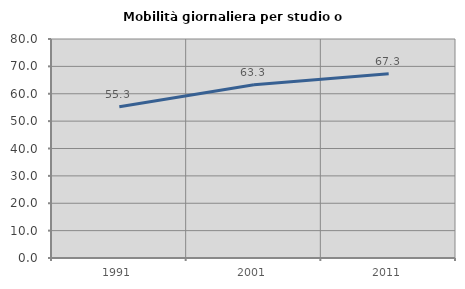
| Category | Mobilità giornaliera per studio o lavoro |
|---|---|
| 1991.0 | 55.269 |
| 2001.0 | 63.259 |
| 2011.0 | 67.34 |